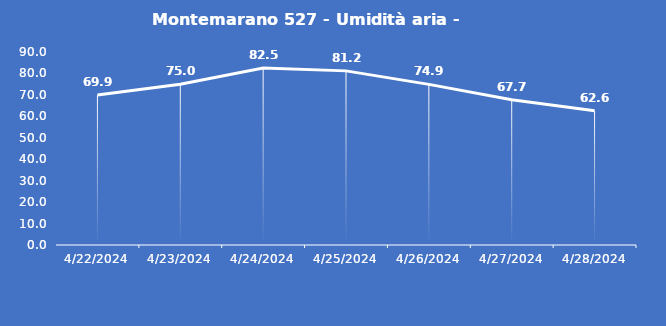
| Category | Montemarano 527 - Umidità aria - Grezzo (%) |
|---|---|
| 4/22/24 | 69.9 |
| 4/23/24 | 75 |
| 4/24/24 | 82.5 |
| 4/25/24 | 81.2 |
| 4/26/24 | 74.9 |
| 4/27/24 | 67.7 |
| 4/28/24 | 62.6 |